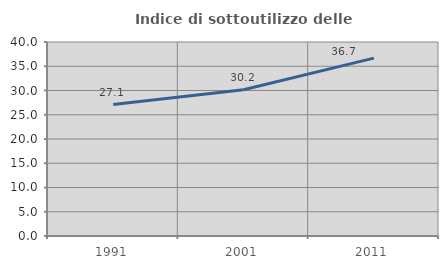
| Category | Indice di sottoutilizzo delle abitazioni  |
|---|---|
| 1991.0 | 27.104 |
| 2001.0 | 30.162 |
| 2011.0 | 36.671 |